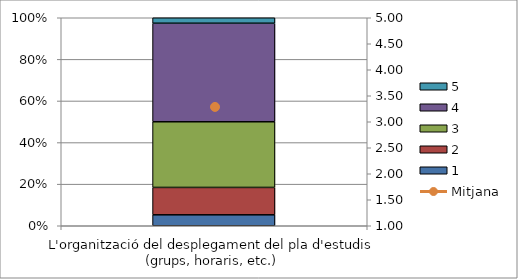
| Category | 1 | 2 | 3 | 4 | 5 |
|---|---|---|---|---|---|
| L'organització del desplegament del pla d'estudis (grups, horaris, etc.) | 2 | 5 | 12 | 18 | 1 |